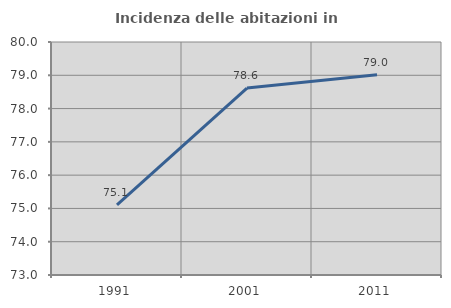
| Category | Incidenza delle abitazioni in proprietà  |
|---|---|
| 1991.0 | 75.11 |
| 2001.0 | 78.616 |
| 2011.0 | 79.015 |